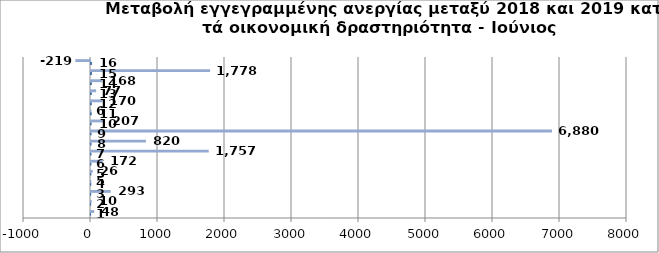
| Category | Series 0 | Series 1 |
|---|---|---|
| 0 | 1 | 48 |
| 1 | 2 | 10 |
| 2 | 3 | 293 |
| 3 | 4 | 5 |
| 4 | 5 | 26 |
| 5 | 6 | 172 |
| 6 | 7 | 1757 |
| 7 | 8 | 820 |
| 8 | 9 | 6880 |
| 9 | 10 | 207 |
| 10 | 11 | 6 |
| 11 | 12 | 170 |
| 12 | 13 | 77 |
| 13 | 14 | 168 |
| 14 | 15 | 1778 |
| 15 | 16 | -219 |